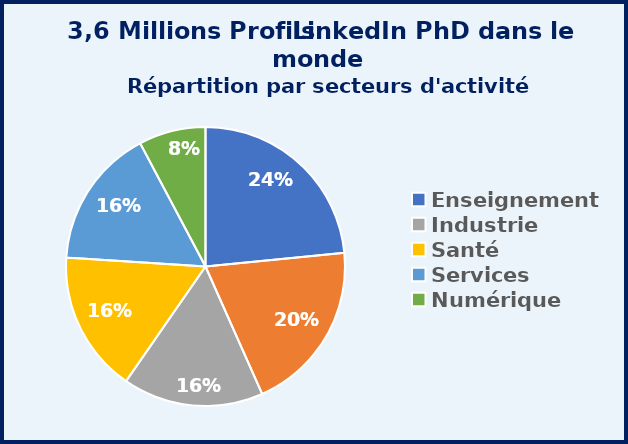
| Category | Series 0 |
|---|---|
| Enseignement | 818 |
| Études/recherche | 695 |
| Industrie | 569 |
| Santé | 572 |
| Services | 566 |
| Numérique | 271 |